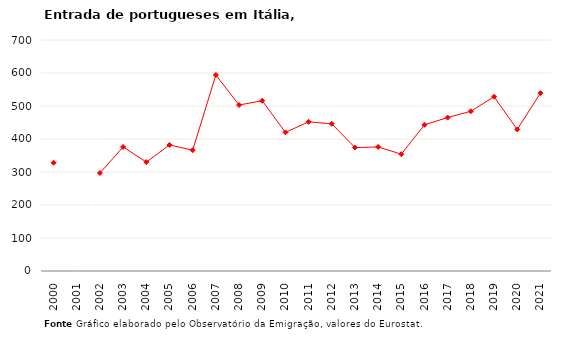
| Category | Entradas |
|---|---|
| 2000.0 | 328 |
| 2001.0 | 0 |
| 2002.0 | 297 |
| 2003.0 | 376 |
| 2004.0 | 330 |
| 2005.0 | 382 |
| 2006.0 | 366 |
| 2007.0 | 594 |
| 2008.0 | 503 |
| 2009.0 | 516 |
| 2010.0 | 420 |
| 2011.0 | 452 |
| 2012.0 | 446 |
| 2013.0 | 374 |
| 2014.0 | 376 |
| 2015.0 | 354 |
| 2016.0 | 443 |
| 2017.0 | 465 |
| 2018.0 | 484 |
| 2019.0 | 528 |
| 2020.0 | 429 |
| 2021.0 | 539 |